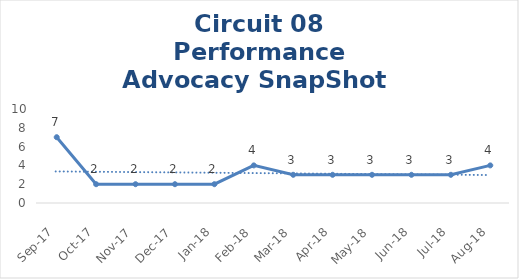
| Category | Circuit 08 |
|---|---|
| Sep-17 | 7 |
| Oct-17 | 2 |
| Nov-17 | 2 |
| Dec-17 | 2 |
| Jan-18 | 2 |
| Feb-18 | 4 |
| Mar-18 | 3 |
| Apr-18 | 3 |
| May-18 | 3 |
| Jun-18 | 3 |
| Jul-18 | 3 |
| Aug-18 | 4 |